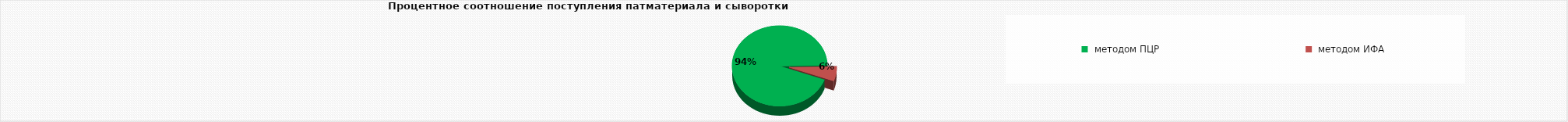
| Category | сыворотка | 1718 |
|---|---|---|
|  методом ПЦР | 1718 |  |
|  методом ИФА | 107 |  |